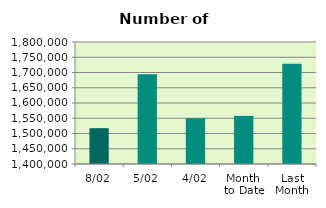
| Category | Series 0 |
|---|---|
| 8/02 | 1517386 |
| 5/02 | 1694252 |
| 4/02 | 1549796 |
| Month 
to Date | 1557786.333 |
| Last
Month | 1728874.4 |